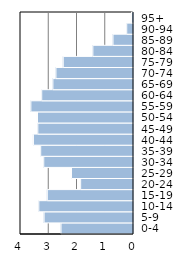
| Category | Series 0 |
|---|---|
| 0-4 | 2.565 |
| 5-9 | 3.165 |
| 10-14 | 3.351 |
| 15-19 | 3.051 |
| 20-24 | 1.87 |
| 25-29 | 2.194 |
| 30-34 | 3.177 |
| 35-39 | 3.285 |
| 40-44 | 3.543 |
| 45-49 | 3.387 |
| 50-54 | 3.399 |
| 55-59 | 3.632 |
| 60-64 | 3.249 |
| 65-69 | 2.853 |
| 70-74 | 2.745 |
| 75-79 | 2.488 |
| 80-84 | 1.439 |
| 85-89 | 0.725 |
| 90-94 | 0.24 |
| 95+ | 0.072 |